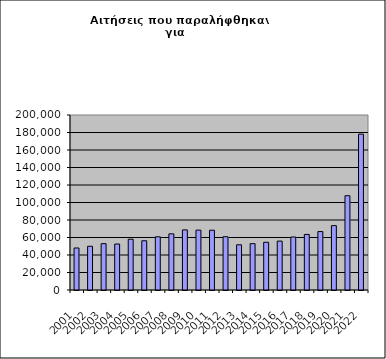
| Category | Series 1 |
|---|---|
| 2001.0 | 48010 |
| 2002.0 | 49998 |
| 2003.0 | 52964 |
| 2004.0 | 52551 |
| 2005.0 | 58046 |
| 2006.0 | 56263 |
| 2007.0 | 60792 |
| 2008.0 | 64163 |
| 2009.0 | 68694 |
| 2010.0 | 68418 |
| 2011.0 | 68310 |
| 2012.0 | 60877 |
| 2013.0 | 51662 |
| 2014.0 | 52955 |
| 2015.0 | 54542 |
| 2016.0 | 55868 |
| 2017.0 | 60582 |
| 2018.0 | 63509 |
| 2019.0 | 66782 |
| 2020.0 | 73559 |
| 2021.0 | 107762 |
| 2022.0 | 178139 |